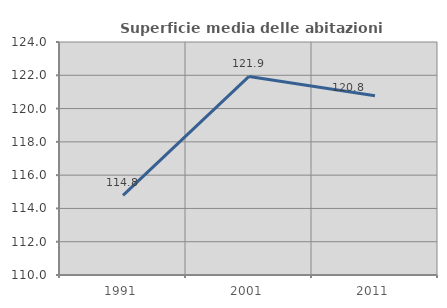
| Category | Superficie media delle abitazioni occupate |
|---|---|
| 1991.0 | 114.782 |
| 2001.0 | 121.931 |
| 2011.0 | 120.767 |